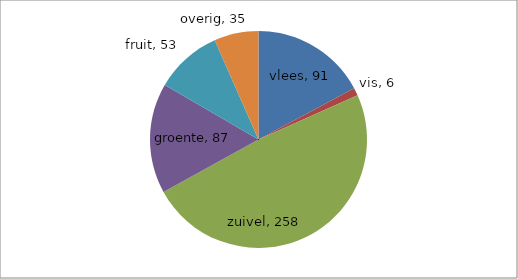
| Category | Series 0 |
|---|---|
| vlees | 91 |
| vis | 6 |
| zuivel | 258 |
| groente | 87 |
| fruit | 53 |
| overig | 35 |